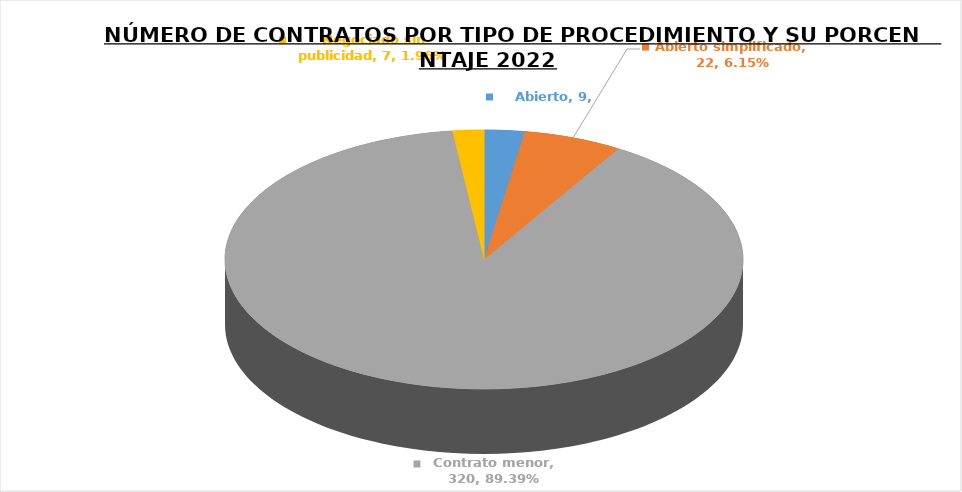
| Category | NÚMERO DE CONTRATOS | PORCENTAJES DE CONTRATOS |
|---|---|---|
| Abierto | 9 | 0.025 |
| Abierto simplificado | 22 | 0.061 |
| Contrato menor | 320 | 0.894 |
| Negociado sin publicidad | 7 | 0.02 |